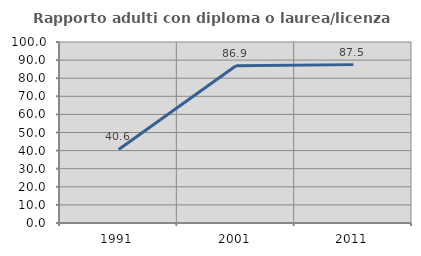
| Category | Rapporto adulti con diploma o laurea/licenza media  |
|---|---|
| 1991.0 | 40.625 |
| 2001.0 | 86.916 |
| 2011.0 | 87.5 |